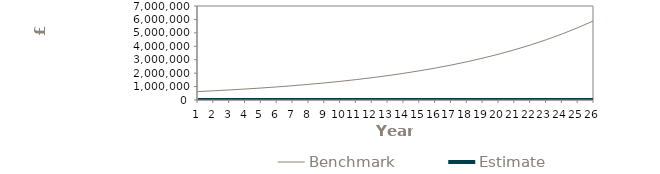
| Category | Benchmark | Estimate |
|---|---|---|
| 0 | 629956.238 | 0 |
| 1 | 687354.617 | 0 |
| 2 | 750157 | 0 |
| 3 | 818883.637 | 0 |
| 4 | 894105.594 | 0 |
| 5 | 976449.761 | 0 |
| 6 | 1066604.362 | 0 |
| 7 | 1165325.001 | 0 |
| 8 | 1273441.316 | 0 |
| 9 | 1391864.291 | 0 |
| 10 | 1521594.294 | 0 |
| 11 | 1663729.912 | 0 |
| 12 | 1819477.663 | 0 |
| 13 | 1990162.674 | 0 |
| 14 | 2177240.422 | 0 |
| 15 | 2382309.633 | 0 |
| 16 | 2607126.475 | 0 |
| 17 | 2853620.154 | 0 |
| 18 | 3123910.063 | 0 |
| 19 | 3420324.637 | 0 |
| 20 | 3745422.082 | 0 |
| 21 | 4102013.171 | 0 |
| 22 | 4493186.301 | 0 |
| 23 | 4922335.053 | 0 |
| 24 | 5393188.487 | 0 |
| 25 | 5909844.461 | 0 |